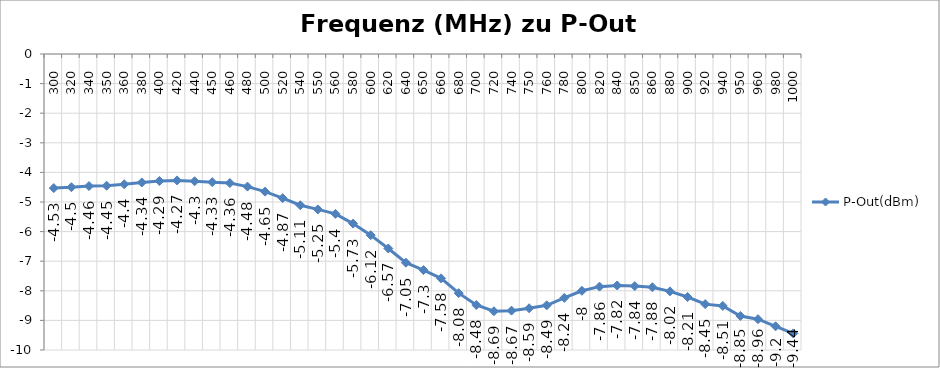
| Category | P-Out(dBm) |
|---|---|
| 300.0 | -4.53 |
| 320.0 | -4.5 |
| 340.0 | -4.46 |
| 350.0 | -4.45 |
| 360.0 | -4.4 |
| 380.0 | -4.34 |
| 400.0 | -4.29 |
| 420.0 | -4.27 |
| 440.0 | -4.3 |
| 450.0 | -4.33 |
| 460.0 | -4.36 |
| 480.0 | -4.48 |
| 500.0 | -4.65 |
| 520.0 | -4.87 |
| 540.0 | -5.11 |
| 550.0 | -5.25 |
| 560.0 | -5.4 |
| 580.0 | -5.73 |
| 600.0 | -6.12 |
| 620.0 | -6.57 |
| 640.0 | -7.05 |
| 650.0 | -7.3 |
| 660.0 | -7.58 |
| 680.0 | -8.08 |
| 700.0 | -8.48 |
| 720.0 | -8.69 |
| 740.0 | -8.67 |
| 750.0 | -8.59 |
| 760.0 | -8.49 |
| 780.0 | -8.24 |
| 800.0 | -8 |
| 820.0 | -7.86 |
| 840.0 | -7.82 |
| 850.0 | -7.84 |
| 860.0 | -7.88 |
| 880.0 | -8.02 |
| 900.0 | -8.21 |
| 920.0 | -8.45 |
| 940.0 | -8.51 |
| 950.0 | -8.85 |
| 960.0 | -8.96 |
| 980.0 | -9.2 |
| 1000.0 | -9.44 |